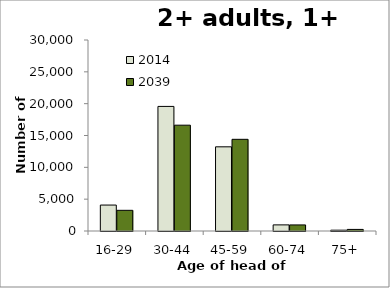
| Category | 2014 | 2039 |
|---|---|---|
| 16-29 | 4075 | 3247 |
| 30-44 | 19569 | 16621 |
| 45-59 | 13222 | 14401 |
| 60-74 | 960 | 954 |
| 75+ | 130 | 250 |